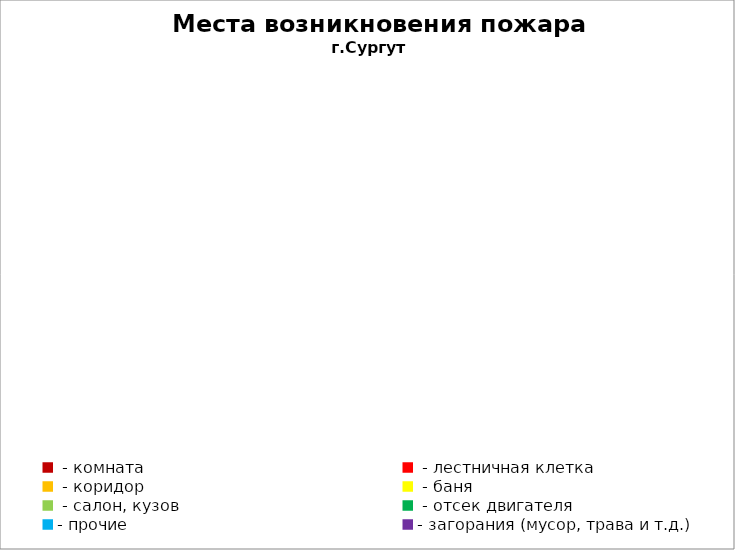
| Category | Места возникновения пожара |
|---|---|
|  - комната | 31 |
|  - лестничная клетка | 3 |
|  - коридор | 2 |
|  - баня | 4 |
|  - салон, кузов | 6 |
|  - отсек двигателя | 12 |
| - прочие | 28 |
| - загорания (мусор, трава и т.д.)  | 19 |